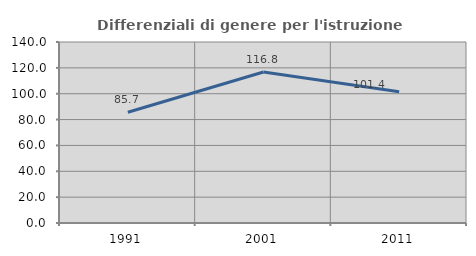
| Category | Differenziali di genere per l'istruzione superiore |
|---|---|
| 1991.0 | 85.674 |
| 2001.0 | 116.828 |
| 2011.0 | 101.445 |